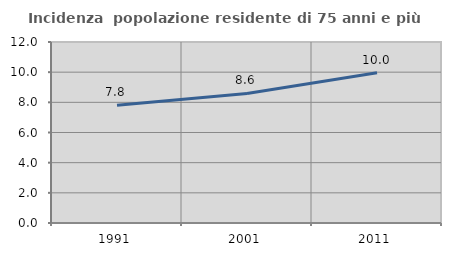
| Category | Incidenza  popolazione residente di 75 anni e più |
|---|---|
| 1991.0 | 7.808 |
| 2001.0 | 8.588 |
| 2011.0 | 9.964 |